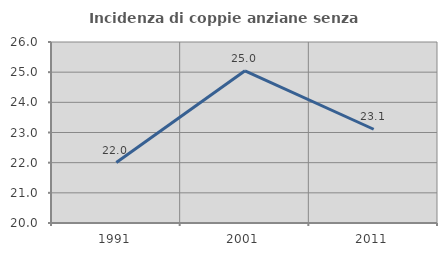
| Category | Incidenza di coppie anziane senza figli  |
|---|---|
| 1991.0 | 22.003 |
| 2001.0 | 25.045 |
| 2011.0 | 23.108 |